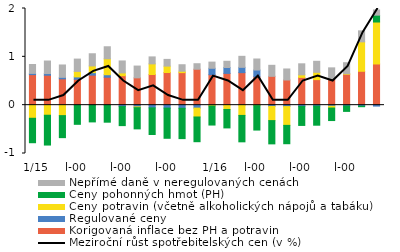
| Category | Korigovaná inflace bez PH a potravin | Regulované ceny | Ceny potravin (včetně alkoholických nápojů a tabáku) | Ceny pohonných hmot (PH) | Nepřímé daně v neregulovaných cenách |
|---|---|---|---|---|---|
|   1/15 | 0.632 | 0.025 | -0.271 | -0.506 | 0.184 |
| 2 | 0.62 | 0.034 | -0.208 | -0.617 | 0.259 |
| 3 | 0.545 | 0.031 | -0.216 | -0.456 | 0.256 |
| 4 | 0.537 | 0.048 | 0.113 | -0.396 | 0.255 |
| 5 | 0.622 | 0.051 | 0.139 | -0.346 | 0.252 |
| 6 | 0.579 | 0.051 | 0.33 | -0.352 | 0.249 |
| 7 | 0.61 | -0.029 | 0.058 | -0.395 | 0.247 |
| 8 | 0.565 | -0.036 | -0.016 | -0.439 | 0.244 |
| 9 | 0.635 | -0.056 | 0.22 | -0.551 | 0.144 |
| 10 | 0.675 | -0.061 | 0.133 | -0.624 | 0.139 |
| 11 | 0.673 | -0.064 | 0.029 | -0.628 | 0.134 |
| 12 | 0.743 | -0.061 | -0.183 | -0.511 | 0.114 |
|   1/16 | 0.63 | 0.133 | -0.017 | -0.394 | 0.128 |
| 2 | 0.658 | 0.122 | -0.089 | -0.382 | 0.128 |
| 3 | 0.673 | 0.11 | -0.212 | -0.546 | 0.228 |
| 4 | 0.587 | 0.14 | -0.009 | -0.506 | 0.228 |
| 5 | 0.597 | -0.026 | -0.293 | -0.482 | 0.228 |
| 6 | 0.521 | -0.029 | -0.389 | -0.38 | 0.228 |
| 7 | 0.574 | -0.026 | 0.053 | -0.393 | 0.228 |
| 8 | 0.529 | -0.019 | 0.151 | -0.395 | 0.228 |
| 9 | 0.544 | -0.022 | -0.037 | -0.259 | 0.228 |
| 10 | 0.64 | -0.017 | 0.01 | -0.112 | 0.228 |
| 11 | 0.701 | -0.021 | 0.609 | -0.011 | 0.228 |
| 12 | 0.852 | -0.019 | 0.868 | 0.142 | 0.107 |